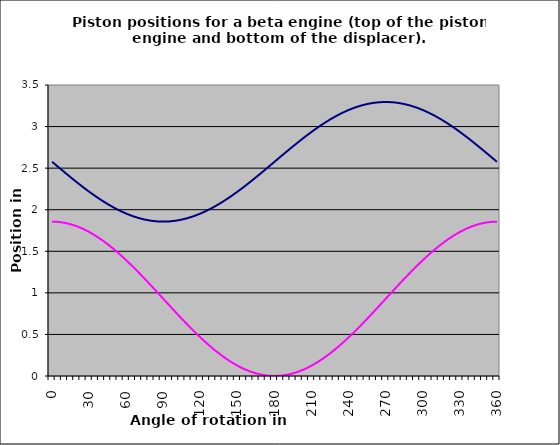
| Category | Position de la surface supérieure      du piston moteur. | Position de la surface inférieure du piston de déplacement |
|---|---|---|
| 0.0 | 1.857 | 2.576 |
| 5.0 | 1.853 | 2.514 |
| 10.0 | 1.843 | 2.451 |
| 15.0 | 1.825 | 2.39 |
| 20.0 | 1.801 | 2.33 |
| 25.0 | 1.77 | 2.272 |
| 30.0 | 1.732 | 2.217 |
| 35.0 | 1.689 | 2.164 |
| 40.0 | 1.64 | 2.114 |
| 45.0 | 1.585 | 2.068 |
| 50.0 | 1.525 | 2.025 |
| 55.0 | 1.461 | 1.987 |
| 60.0 | 1.393 | 1.953 |
| 65.0 | 1.321 | 1.924 |
| 70.0 | 1.246 | 1.9 |
| 75.0 | 1.169 | 1.881 |
| 80.0 | 1.09 | 1.868 |
| 85.0 | 1.009 | 1.859 |
| 90.0 | 0.928 | 1.857 |
| 95.0 | 0.847 | 1.859 |
| 100.0 | 0.767 | 1.868 |
| 105.0 | 0.688 | 1.881 |
| 110.0 | 0.611 | 1.9 |
| 115.0 | 0.536 | 1.924 |
| 120.0 | 0.464 | 1.953 |
| 125.0 | 0.396 | 1.987 |
| 130.0 | 0.332 | 2.025 |
| 135.0 | 0.272 | 2.068 |
| 140.0 | 0.217 | 2.114 |
| 145.0 | 0.168 | 2.164 |
| 150.0 | 0.124 | 2.217 |
| 155.0 | 0.087 | 2.272 |
| 160.0 | 0.056 | 2.33 |
| 165.0 | 0.032 | 2.39 |
| 170.0 | 0.014 | 2.451 |
| 175.0 | 0.004 | 2.514 |
| 180.0 | 0 | 2.576 |
| 185.0 | 0.004 | 2.639 |
| 190.0 | 0.014 | 2.701 |
| 195.0 | 0.032 | 2.763 |
| 200.0 | 0.056 | 2.822 |
| 205.0 | 0.087 | 2.88 |
| 210.0 | 0.124 | 2.936 |
| 215.0 | 0.168 | 2.989 |
| 220.0 | 0.217 | 3.039 |
| 225.0 | 0.272 | 3.085 |
| 230.0 | 0.332 | 3.127 |
| 235.0 | 0.396 | 3.166 |
| 240.0 | 0.464 | 3.199 |
| 245.0 | 0.536 | 3.228 |
| 250.0 | 0.611 | 3.252 |
| 255.0 | 0.688 | 3.271 |
| 260.0 | 0.767 | 3.285 |
| 265.0 | 0.847 | 3.293 |
| 270.0 | 0.928 | 3.296 |
| 275.0 | 1.009 | 3.293 |
| 280.0 | 1.09 | 3.285 |
| 285.0 | 1.169 | 3.271 |
| 290.0 | 1.246 | 3.252 |
| 295.0 | 1.321 | 3.228 |
| 300.0 | 1.393 | 3.199 |
| 305.0 | 1.461 | 3.166 |
| 310.0 | 1.525 | 3.127 |
| 315.0 | 1.585 | 3.085 |
| 320.0 | 1.64 | 3.039 |
| 325.0 | 1.689 | 2.989 |
| 330.0 | 1.732 | 2.936 |
| 335.0 | 1.77 | 2.88 |
| 340.0 | 1.801 | 2.822 |
| 345.0 | 1.825 | 2.763 |
| 350.0 | 1.843 | 2.701 |
| 355.0 | 1.853 | 2.639 |
| 360.0 | 1.857 | 2.576 |